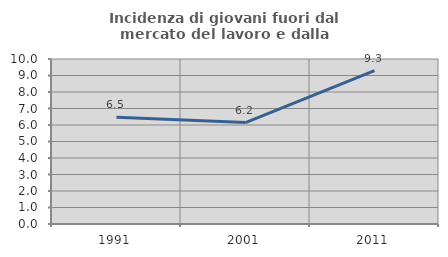
| Category | Incidenza di giovani fuori dal mercato del lavoro e dalla formazione  |
|---|---|
| 1991.0 | 6.463 |
| 2001.0 | 6.15 |
| 2011.0 | 9.29 |